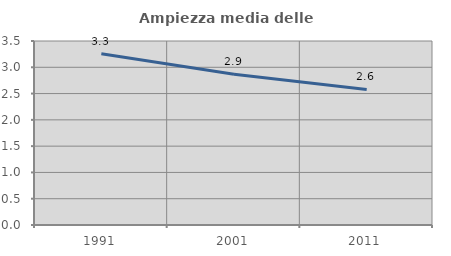
| Category | Ampiezza media delle famiglie |
|---|---|
| 1991.0 | 3.256 |
| 2001.0 | 2.869 |
| 2011.0 | 2.579 |